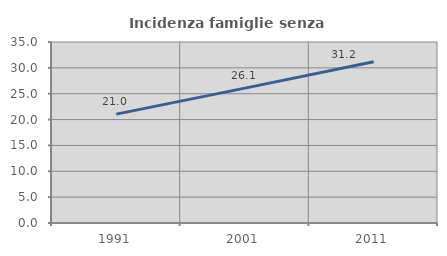
| Category | Incidenza famiglie senza nuclei |
|---|---|
| 1991.0 | 21.049 |
| 2001.0 | 26.085 |
| 2011.0 | 31.165 |